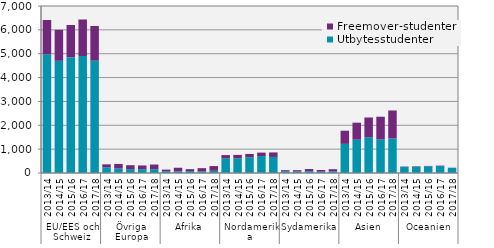
| Category | Utbytesstudenter | Freemover-studenter |
|---|---|---|
| 0 | 4975 | 1439 |
| 1 | 4704 | 1297 |
| 2 | 4856 | 1348 |
| 3 | 4903 | 1531 |
| 4 | 4711 | 1452 |
| 5 | 237 | 126 |
| 6 | 187 | 193 |
| 7 | 165 | 162 |
| 8 | 162 | 154 |
| 9 | 160 | 195 |
| 10 | 74 | 68 |
| 11 | 69 | 151 |
| 12 | 79 | 82 |
| 13 | 67 | 136 |
| 14 | 94 | 196 |
| 15 | 618 | 133 |
| 16 | 617 | 142 |
| 17 | 664 | 135 |
| 18 | 713 | 142 |
| 19 | 673 | 189 |
| 20 | 72 | 46 |
| 21 | 60 | 58 |
| 22 | 75 | 91 |
| 23 | 57 | 70 |
| 24 | 71 | 88 |
| 25 | 1221 | 552 |
| 26 | 1397 | 712 |
| 27 | 1501 | 826 |
| 28 | 1410 | 949 |
| 29 | 1449 | 1172 |
| 30 | 261 | 12 |
| 31 | 266 | 18 |
| 32 | 282 | 14 |
| 33 | 295 | 15 |
| 34 | 211 | 10 |